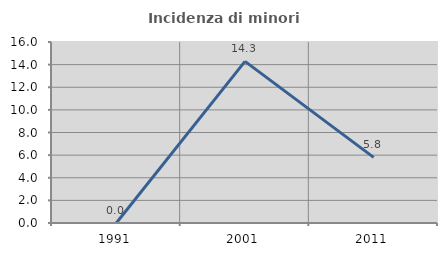
| Category | Incidenza di minori stranieri |
|---|---|
| 1991.0 | 0 |
| 2001.0 | 14.286 |
| 2011.0 | 5.797 |